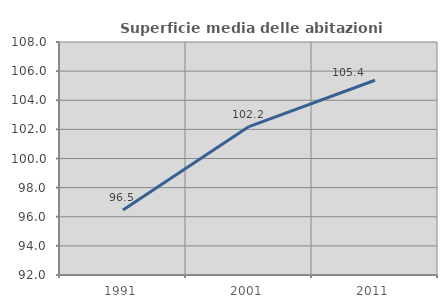
| Category | Superficie media delle abitazioni occupate |
|---|---|
| 1991.0 | 96.459 |
| 2001.0 | 102.193 |
| 2011.0 | 105.375 |